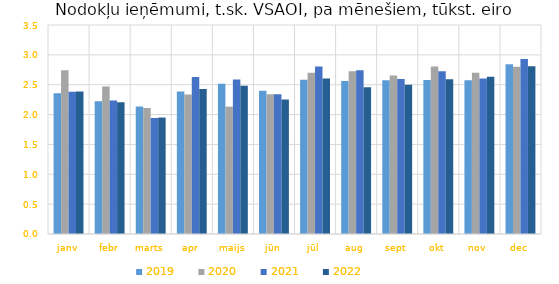
| Category | 2019 | 2020 | 2021 | 2022 |
|---|---|---|---|---|
| janv | 2.356 | 2.744 | 2.382 | 2.388 |
| febr | 2.224 | 2.471 | 2.236 | 2.208 |
| marts | 2.135 | 2.11 | 1.941 | 1.95 |
| apr | 2.385 | 2.336 | 2.63 | 2.429 |
| maijs | 2.517 | 2.132 | 2.587 | 2.482 |
| jūn | 2.4 | 2.34 | 2.339 | 2.254 |
| jūl | 2.582 | 2.7 | 2.806 | 2.605 |
| aug | 2.562 | 2.724 | 2.743 | 2.459 |
| sept | 2.574 | 2.654 | 2.595 | 2.499 |
| okt | 2.579 | 2.805 | 2.726 | 2.59 |
| nov | 2.576 | 2.701 | 2.606 | 2.633 |
| dec | 2.842 | 2.801 | 2.93 | 2.808 |